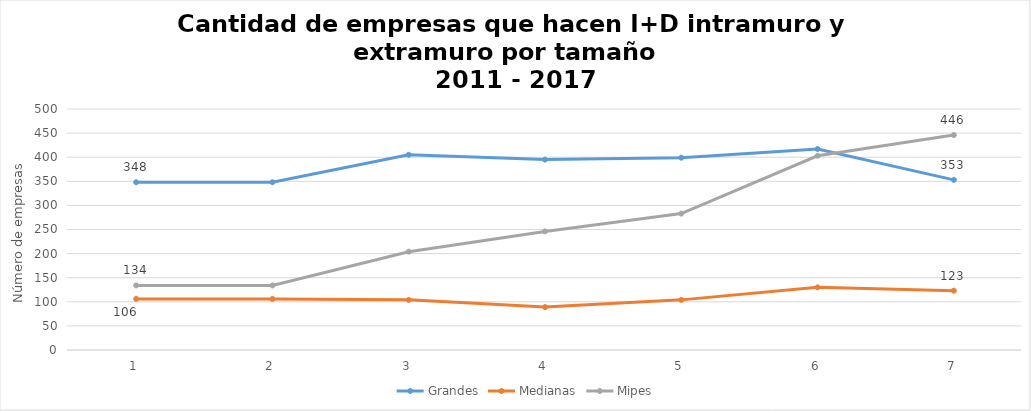
| Category | Grandes | Medianas | Mipes |
|---|---|---|---|
| 0 | 348 | 106 | 134 |
| 1 | 348 | 106 | 134 |
| 2 | 405 | 104 | 204 |
| 3 | 395 | 89 | 246 |
| 4 | 399 | 104 | 283 |
| 5 | 417 | 130 | 403 |
| 6 | 353 | 123 | 446 |